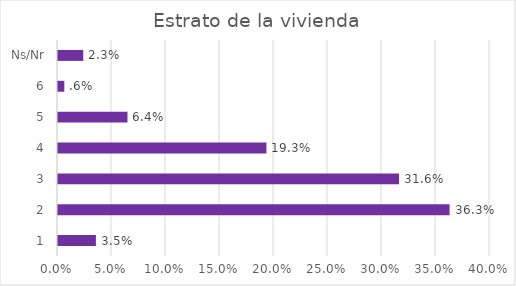
| Category | Series 0 |
|---|---|
| 1 | 0.035 |
| 2 | 0.363 |
| 3 | 0.316 |
| 4 | 0.193 |
| 5 | 0.064 |
| 6 | 0.006 |
| Ns/Nr | 0.023 |